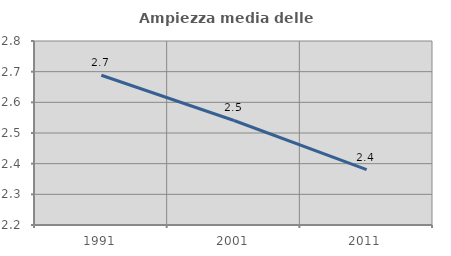
| Category | Ampiezza media delle famiglie |
|---|---|
| 1991.0 | 2.688 |
| 2001.0 | 2.541 |
| 2011.0 | 2.381 |